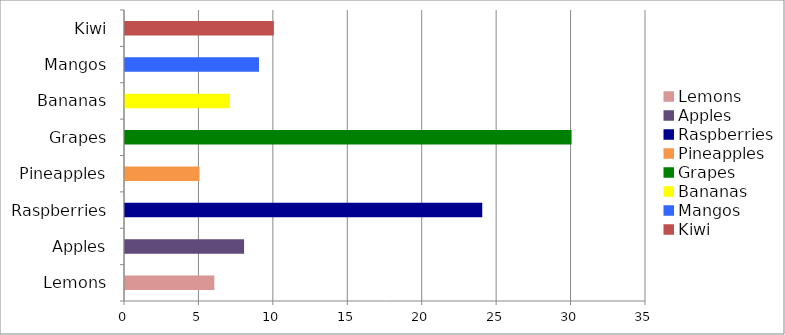
| Category | Series 0 |
|---|---|
| Lemons | 6 |
| Apples | 8 |
| Raspberries | 24 |
| Pineapples | 5 |
| Grapes | 30 |
| Bananas | 7 |
| Mangos | 9 |
| Kiwi | 10 |